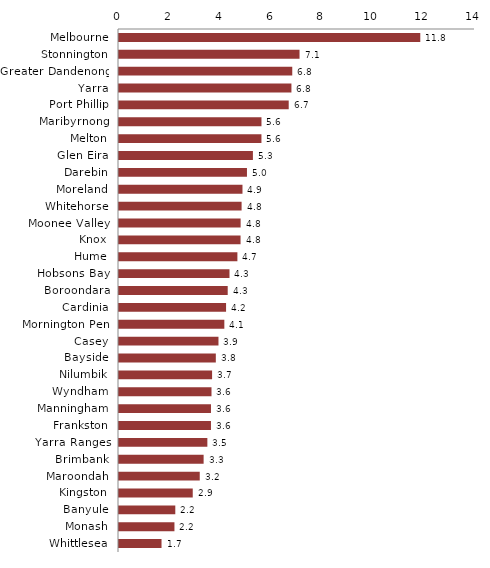
| Category | Series 0 |
|---|---|
| Melbourne | 11.848 |
| Stonnington | 7.1 |
| Greater Dandenong | 6.814 |
| Yarra | 6.781 |
| Port Phillip | 6.674 |
| Maribyrnong | 5.603 |
| Melton | 5.602 |
| Glen Eira | 5.266 |
| Darebin | 5.032 |
| Moreland | 4.856 |
| Whitehorse | 4.821 |
| Moonee Valley | 4.783 |
| Knox | 4.78 |
| Hume | 4.656 |
| Hobsons Bay | 4.345 |
| Boroondara | 4.275 |
| Cardinia | 4.21 |
| Mornington Pen | 4.142 |
| Casey | 3.912 |
| Bayside | 3.807 |
| Nilumbik | 3.661 |
| Wyndham | 3.638 |
| Manningham | 3.617 |
| Frankston | 3.617 |
| Yarra Ranges | 3.475 |
| Brimbank | 3.328 |
| Maroondah | 3.175 |
| Kingston | 2.9 |
| Banyule | 2.214 |
| Monash | 2.181 |
| Whittlesea | 1.672 |